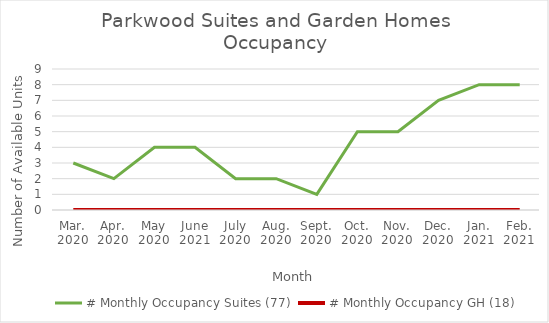
| Category | # Monthly Occupancy Suites (77) | # Monthly Occupancy GH (18) |
|---|---|---|
| Mar.
2020 | 3 | 0 |
| Apr.
2020 | 2 | 0 |
| May
2020 | 4 | 0 |
| June
2021 | 4 | 0 |
| July
2020 | 2 | 0 |
| Aug.
2020 | 2 | 0 |
| Sept.
2020 | 1 | 0 |
| Oct.
2020 | 5 | 0 |
| Nov.
2020 | 5 | 0 |
| Dec.
2020 | 7 | 0 |
| Jan.
2021 | 8 | 0 |
| Feb.
2021 | 8 | 0 |